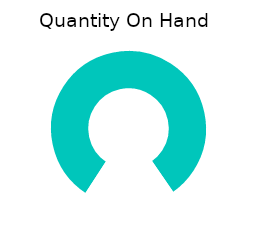
| Category | Quantity On Hand |
|---|---|
| 0 | 130 |
| 1 | 0 |
| 2 | 30 |